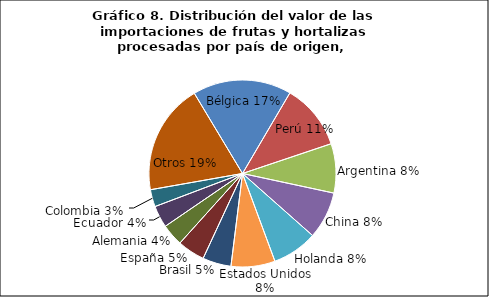
| Category | Series 0 |
|---|---|
| Bélgica | 33755369.86 |
| Perú | 22511077.12 |
| Argentina | 16843810.33 |
| China | 16153476.94 |
| Holanda | 15484833.49 |
| Estados Unidos | 15047119.98 |
| Brasil | 9759854.69 |
| España | 9396975.8 |
| Alemania | 7500374.45 |
| Ecuador | 7494813.1 |
| Colombia | 5875064.8 |
| Otros | 37908415.55 |